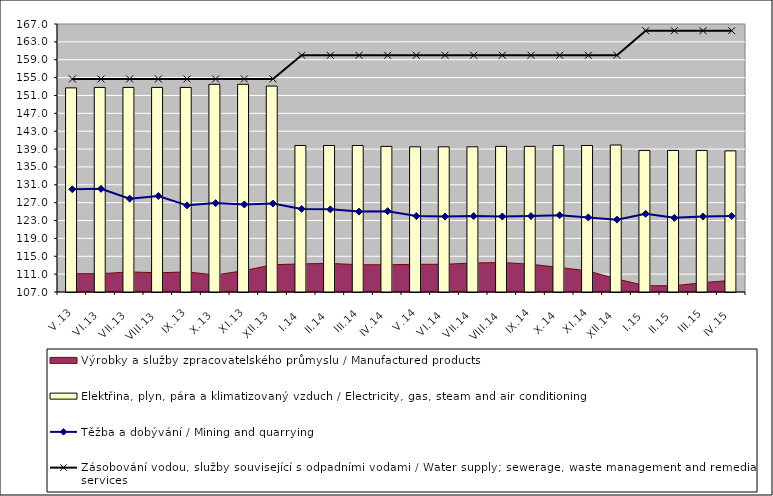
| Category | Elektřina, plyn, pára a klimatizovaný vzduch / Electricity, gas, steam and air conditioning |
|---|---|
| V.13 | 152.7 |
| VI.13 | 152.8 |
| VII.13 | 152.8 |
| VIII.13 | 152.8 |
| IX.13 | 152.8 |
| X.13 | 153.5 |
| XI.13 | 153.5 |
| XII.13 | 153.1 |
| I.14 | 139.8 |
| II.14 | 139.8 |
| III.14 | 139.8 |
| IV.14 | 139.6 |
| V.14 | 139.5 |
| VI.14 | 139.5 |
| VII.14 | 139.5 |
| VIII.14 | 139.6 |
| IX.14 | 139.6 |
| X.14 | 139.8 |
| XI.14 | 139.8 |
| XII.14 | 139.9 |
| I.15 | 138.7 |
| II.15 | 138.7 |
| III.15 | 138.7 |
| IV.15 | 138.6 |